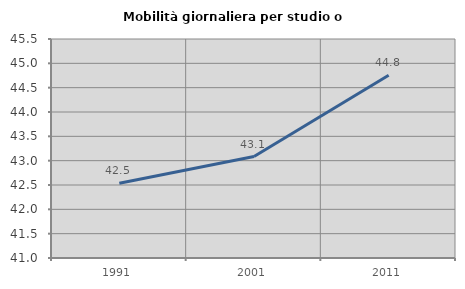
| Category | Mobilità giornaliera per studio o lavoro |
|---|---|
| 1991.0 | 42.537 |
| 2001.0 | 43.085 |
| 2011.0 | 44.754 |